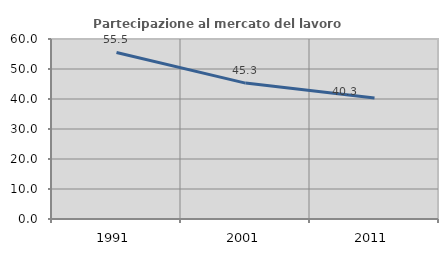
| Category | Partecipazione al mercato del lavoro  femminile |
|---|---|
| 1991.0 | 55.502 |
| 2001.0 | 45.296 |
| 2011.0 | 40.322 |